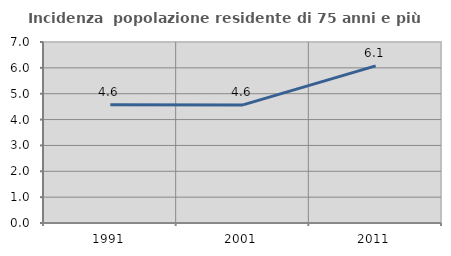
| Category | Incidenza  popolazione residente di 75 anni e più |
|---|---|
| 1991.0 | 4.575 |
| 2001.0 | 4.566 |
| 2011.0 | 6.076 |